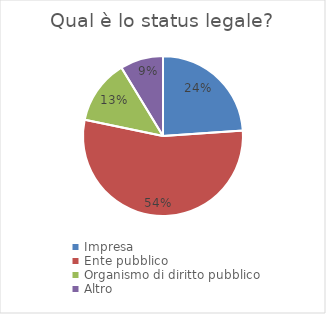
| Category | Qual è lo status legale? |
|---|---|
| Impresa | 0.239 |
| Ente pubblico | 0.543 |
| Organismo di diritto pubblico | 0.13 |
| Altro | 0.087 |